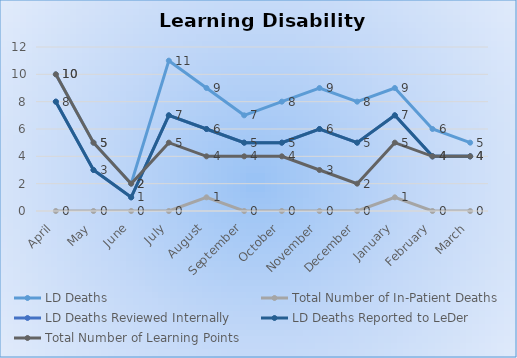
| Category | LD Deaths | Total Number of In-Patient Deaths | LD Deaths Reviewed Internally | LD Deaths Reported to LeDer | Total Number of Learning Points |
|---|---|---|---|---|---|
| April | 10 | 0 | 8 | 8 | 10 |
| May | 5 | 0 | 3 | 3 | 5 |
| June | 2 | 0 | 1 | 1 | 2 |
| July | 11 | 0 | 7 | 7 | 5 |
| August | 9 | 1 | 6 | 6 | 4 |
| September | 7 | 0 | 5 | 5 | 4 |
| October | 8 | 0 | 5 | 5 | 4 |
| November | 9 | 0 | 6 | 6 | 3 |
| December | 8 | 0 | 5 | 5 | 2 |
| January | 9 | 1 | 7 | 7 | 5 |
| February | 6 | 0 | 4 | 4 | 4 |
| March | 5 | 0 | 4 | 4 | 4 |